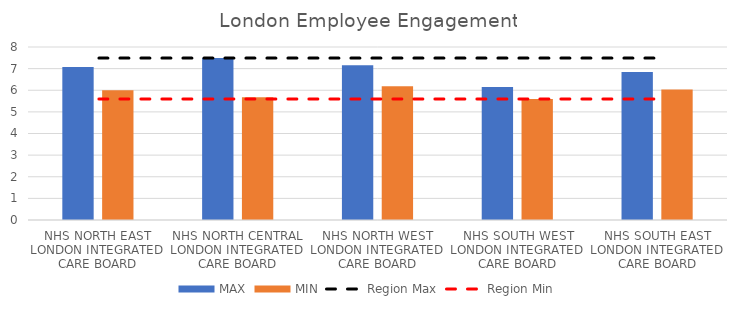
| Category | MAX | MIN |
|---|---|---|
| NHS NORTH EAST LONDON INTEGRATED CARE BOARD | 7.078 | 6.002 |
| NHS NORTH CENTRAL LONDON INTEGRATED CARE BOARD | 7.488 | 5.677 |
| NHS NORTH WEST LONDON INTEGRATED CARE BOARD | 7.153 | 6.182 |
| NHS SOUTH WEST LONDON INTEGRATED CARE BOARD | 6.147 | 5.596 |
| NHS SOUTH EAST LONDON INTEGRATED CARE BOARD | 6.84 | 6.039 |